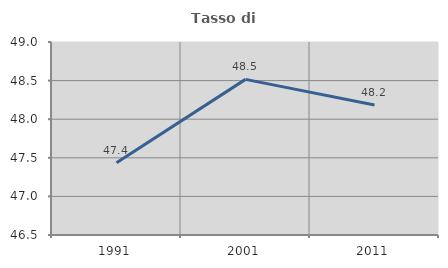
| Category | Tasso di occupazione   |
|---|---|
| 1991.0 | 47.437 |
| 2001.0 | 48.516 |
| 2011.0 | 48.183 |